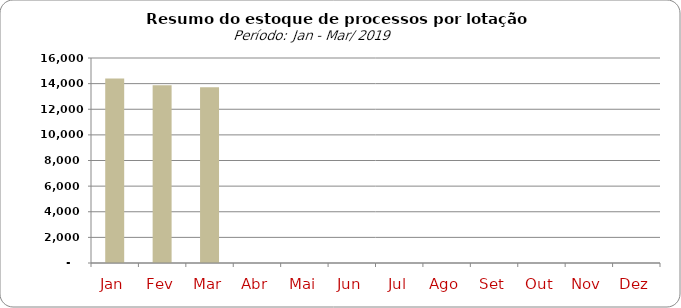
| Category | Series 0 |
|---|---|
| Jan | 14401 |
| Fev | 13878 |
| Mar | 13715 |
| Abr | 0 |
| Mai | 0 |
| Jun | 0 |
| Jul | 0 |
| Ago | 0 |
| Set | 0 |
| Out | 0 |
| Nov | 0 |
| Dez | 0 |